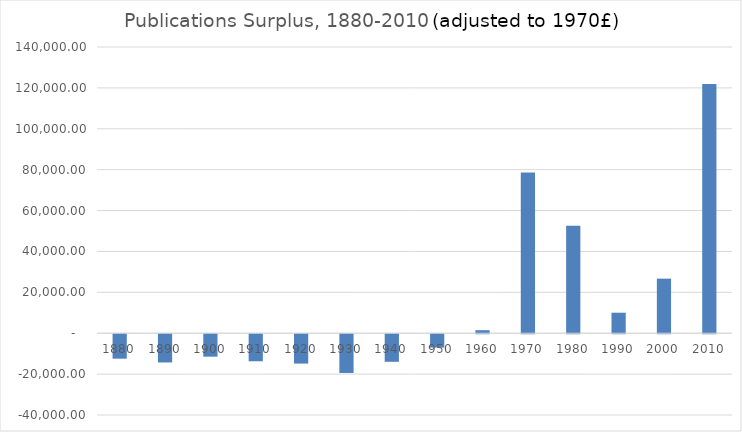
| Category | PUBLICATIONS BALANCE (before grants) |
|---|---|
| 1880.0 | -11962.744 |
| 1890.0 | -13807.947 |
| 1900.0 | -10979.519 |
| 1910.0 | -13224.938 |
| 1920.0 | -14364.809 |
| 1930.0 | -18942.805 |
| 1940.0 | -13490.289 |
| 1950.0 | -6540.857 |
| 1960.0 | 1485.617 |
| 1970.0 | 78579 |
| 1980.0 | 52530.678 |
| 1990.0 | 10038.084 |
| 2000.0 | 26688.028 |
| 2010.0 | 121868.852 |